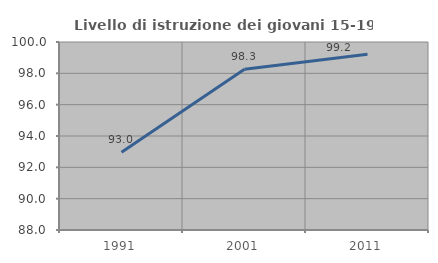
| Category | Livello di istruzione dei giovani 15-19 anni |
|---|---|
| 1991.0 | 92.962 |
| 2001.0 | 98.261 |
| 2011.0 | 99.213 |